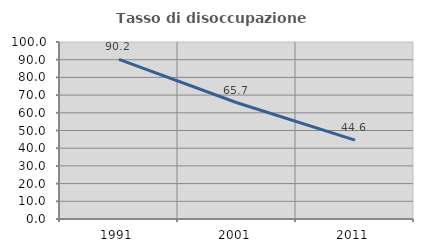
| Category | Tasso di disoccupazione giovanile  |
|---|---|
| 1991.0 | 90.153 |
| 2001.0 | 65.66 |
| 2011.0 | 44.565 |